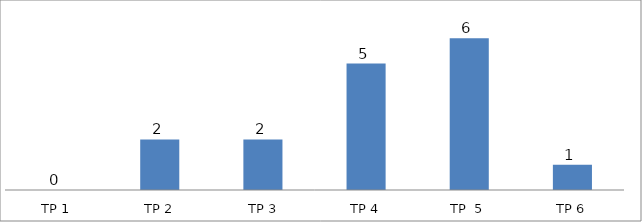
| Category | BIL. MURID |
|---|---|
| TP 1 | 0 |
| TP 2 | 2 |
|  TP 3 | 2 |
| TP 4 | 5 |
| TP  5 | 6 |
| TP 6 | 1 |